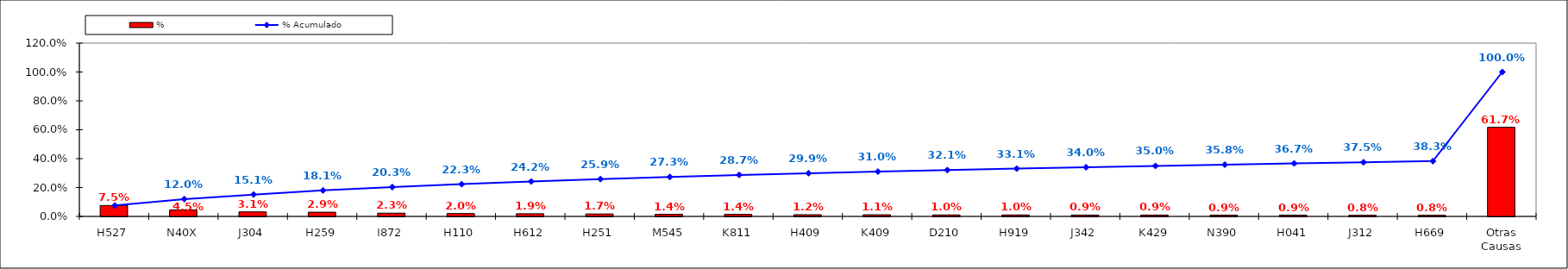
| Category | % |
|---|---|
| H527 | 0.075 |
| N40X | 0.045 |
| J304 | 0.031 |
| H259 | 0.029 |
| I872 | 0.023 |
| H110 | 0.02 |
| H612 | 0.019 |
| H251 | 0.017 |
| M545 | 0.014 |
| K811 | 0.014 |
| H409 | 0.012 |
| K409 | 0.011 |
| D210 | 0.01 |
| H919 | 0.01 |
| J342 | 0.009 |
| K429 | 0.009 |
| N390 | 0.009 |
| H041 | 0.009 |
| J312 | 0.008 |
| H669 | 0.008 |
| Otras Causas | 0.617 |